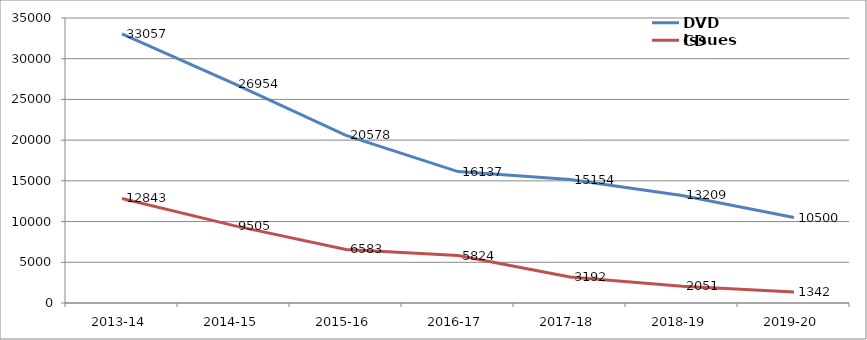
| Category | DVD Issues | CD Issues |
|---|---|---|
| 2013-14 | 33057 | 12843 |
| 2014-15 | 26954 | 9505 |
| 2015-16 | 20578 | 6583 |
| 2016-17 | 16137 | 5824 |
| 2017-18 | 15154 | 3192 |
| 2018-19 | 13209 | 2051 |
| 2019-20 | 10500 | 1342 |